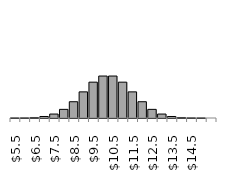
| Category | Tax_Revenue histogram |
|---|---|
| 5.5 | 0 |
| 6.0 | 0 |
| 6.5 | 0.002 |
| 7.0 | 0.006 |
| 7.5 | 0.015 |
| 8.0 | 0.032 |
| 8.5 | 0.06 |
| 9.0 | 0.097 |
| 9.5 | 0.133 |
| 10.0 | 0.155 |
| 10.5 | 0.155 |
| 11.0 | 0.133 |
| 11.5 | 0.097 |
| 12.0 | 0.06 |
| 12.5 | 0.032 |
| 13.0 | 0.015 |
| 13.5 | 0.006 |
| 14.0 | 0.002 |
| 14.5 | 0 |
| 15.0 | 0 |